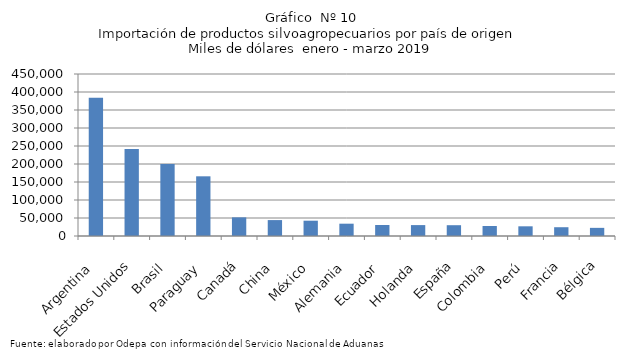
| Category | Series 0 |
|---|---|
| Argentina | 384272.057 |
| Estados Unidos | 241858.951 |
| Brasil | 200209.237 |
| Paraguay | 165796.824 |
| Canadá | 51817.937 |
| China | 44203.161 |
| México | 42514.72 |
| Alemania | 34202.488 |
| Ecuador | 30525.369 |
| Holanda | 30303.121 |
| España | 29990.631 |
| Colombia | 27740.109 |
| Perú | 26914 |
| Francia | 24395.215 |
| Bélgica | 22604.441 |